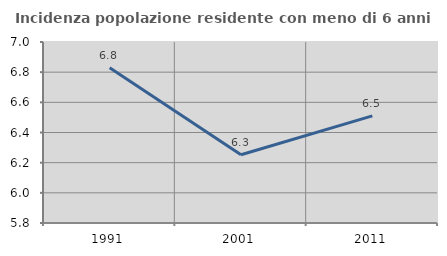
| Category | Incidenza popolazione residente con meno di 6 anni |
|---|---|
| 1991.0 | 6.829 |
| 2001.0 | 6.252 |
| 2011.0 | 6.511 |